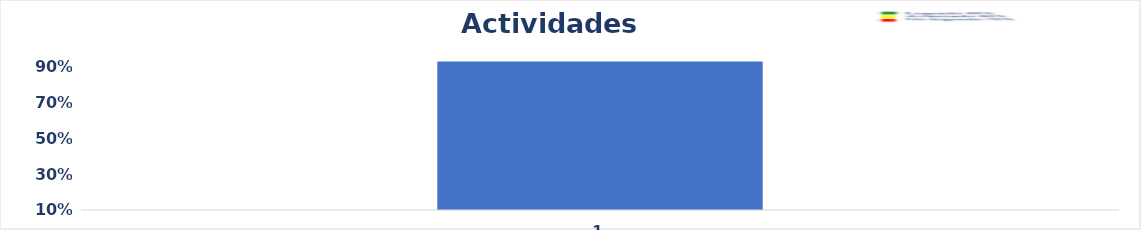
| Category | Series 0 |
|---|---|
| 0 | 0.93 |